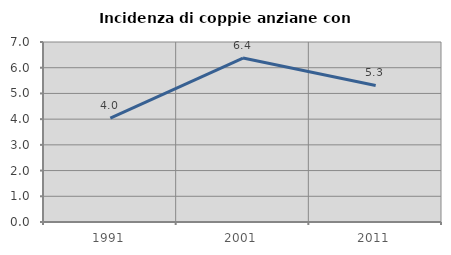
| Category | Incidenza di coppie anziane con figli |
|---|---|
| 1991.0 | 4.044 |
| 2001.0 | 6.375 |
| 2011.0 | 5.31 |